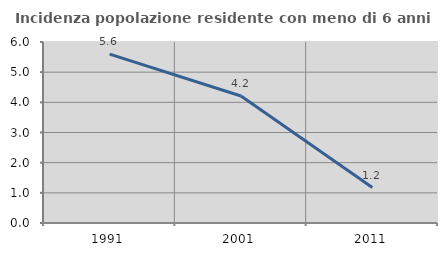
| Category | Incidenza popolazione residente con meno di 6 anni |
|---|---|
| 1991.0 | 5.6 |
| 2001.0 | 4.211 |
| 2011.0 | 1.176 |